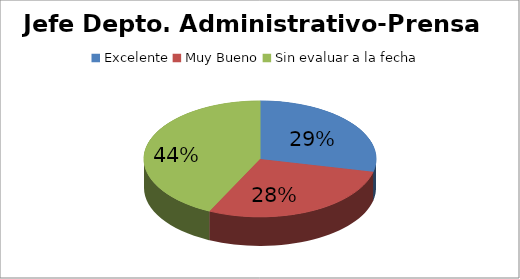
| Category | Cantidad |
|---|---|
| Excelente | 2 |
| Muy Bueno | 2 |
| Sin evaluar a la fecha | 3 |